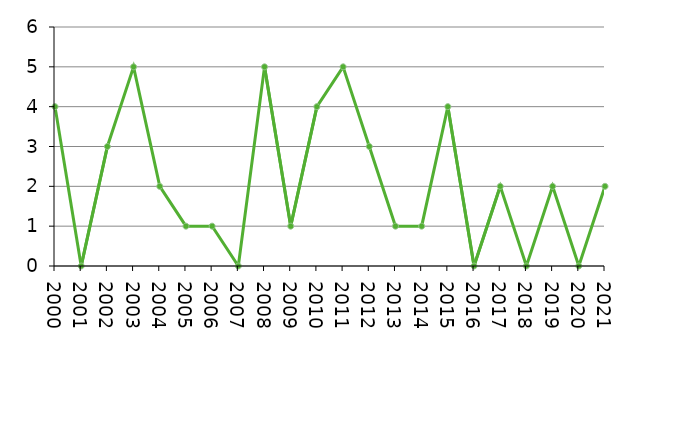
| Category | Avlidna |
|---|---|
| 2000 | 4 |
| 2001 | 0 |
| 2002 | 3 |
| 2003 | 5 |
| 2004 | 2 |
| 2005 | 1 |
| 2006 | 1 |
| 2007 | 0 |
| 2008 | 5 |
| 2009 | 1 |
| 2010 | 4 |
| 2011 | 5 |
| 2012 | 3 |
| 2013 | 1 |
| 2014 | 1 |
| 2015 | 4 |
| 2016 | 0 |
| 2017 | 2 |
| 2018 | 0 |
| 2019 | 2 |
| 2020 | 0 |
| 2021 | 2 |